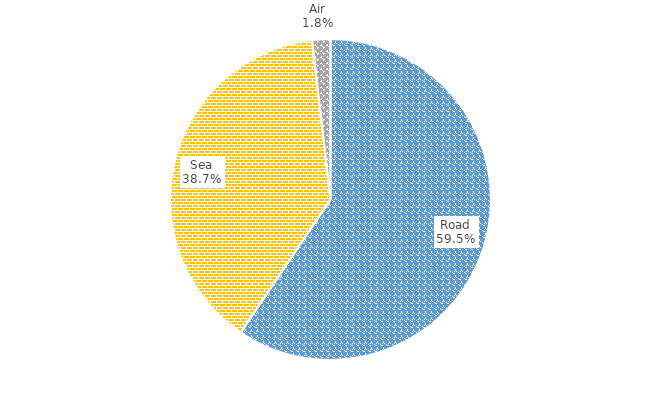
| Category | Series 0 |
|---|---|
| Road | 59.433 |
| Sea | 38.707 |
| Air | 1.841 |